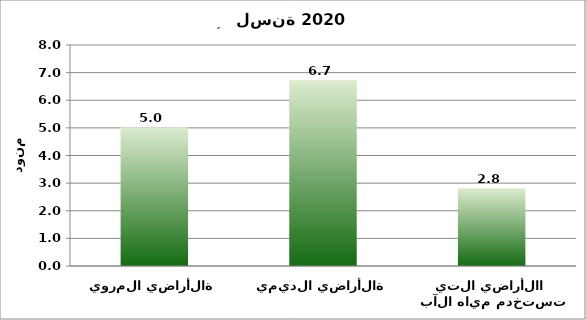
| Category | Series 0 |
|---|---|
| الأراضي المروية | 5.022 |
| الأراضي الديمية | 6.722 |
| الأراضي التي تستخدم مياه الآبار | 2.816 |